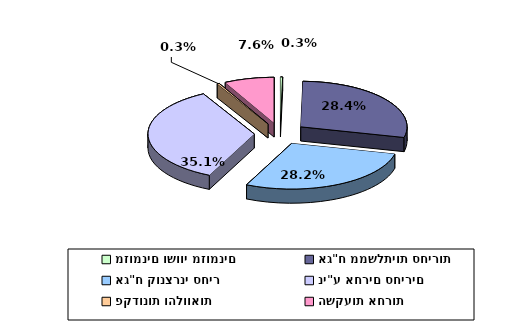
| Category | Series 0 |
|---|---|
| מזומנים ושווי מזומנים | 0.003 |
| אג"ח ממשלתיות סחירות | 0.284 |
| אג"ח קונצרני סחיר | 0.282 |
| ני"ע אחרים סחירים | 0.351 |
| פקדונות והלוואות | 0.003 |
| השקעות אחרות | 0.076 |